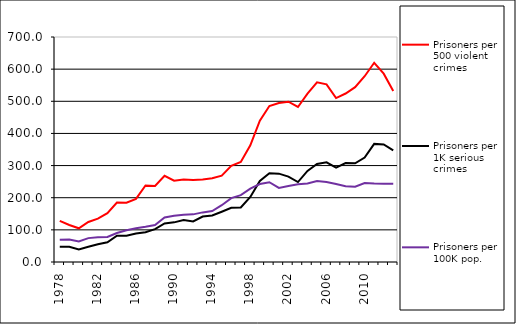
| Category | Prisoners per 500 violent crimes | Prisoners per 1K serious crimes | Prisoners per 100K pop. |
|---|---|---|---|
| 1978.0 | 127.815 | 47.619 | 69.472 |
| 1979.0 | 115.079 | 47.206 | 70.007 |
| 1980.0 | 104.859 | 39.143 | 63.617 |
| 1981.0 | 124.365 | 47.206 | 74.274 |
| 1982.0 | 135.023 | 55.402 | 77.156 |
| 1983.0 | 152.148 | 61.243 | 77.888 |
| 1984.0 | 184.758 | 81.874 | 90.254 |
| 1985.0 | 184.516 | 81.521 | 98.663 |
| 1986.0 | 196.465 | 88.696 | 104.805 |
| 1987.0 | 237.892 | 92.609 | 109.345 |
| 1988.0 | 236.496 | 102.273 | 114.962 |
| 1989.0 | 268.055 | 120.032 | 138.723 |
| 1990.0 | 252.862 | 123.305 | 143.599 |
| 1991.0 | 256.746 | 130.683 | 147.288 |
| 1992.0 | 255.079 | 126.079 | 148.207 |
| 1993.0 | 256.385 | 141.38 | 154.355 |
| 1994.0 | 260.585 | 144.887 | 158.7 |
| 1995.0 | 268.667 | 156.412 | 176.679 |
| 1996.0 | 299.488 | 168.453 | 198.8 |
| 1997.0 | 311.137 | 169.754 | 207.868 |
| 1998.0 | 363.237 | 202.543 | 228.286 |
| 1999.0 | 439.939 | 252.383 | 242.46 |
| 2000.0 | 485.116 | 276.235 | 248.123 |
| 2001.0 | 494.355 | 274.82 | 230.569 |
| 2002.0 | 498.816 | 265.622 | 236.115 |
| 2003.0 | 482.34 | 248.621 | 241.527 |
| 2004.0 | 523.729 | 283.394 | 244.35 |
| 2005.0 | 559.07 | 304.863 | 251.974 |
| 2006.0 | 552.65 | 309.964 | 248.621 |
| 2007.0 | 510.089 | 293.76 | 242.73 |
| 2008.0 | 524.144 | 307.7 | 235.614 |
| 2009.0 | 543.848 | 306.925 | 234.291 |
| 2010.0 | 577.904 | 325.182 | 245.85 |
| 2011.0 | 619.885 | 367.42 | 244.355 |
| 2012.0 | 585.957 | 365.661 | 243.794 |
| 2013.0 | 532.134 | 347.111 | 243.593 |